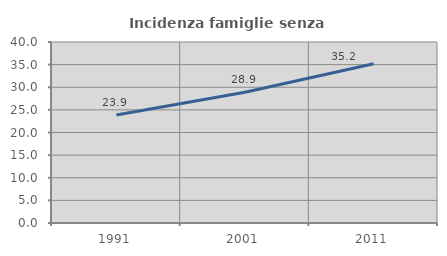
| Category | Incidenza famiglie senza nuclei |
|---|---|
| 1991.0 | 23.886 |
| 2001.0 | 28.885 |
| 2011.0 | 35.196 |